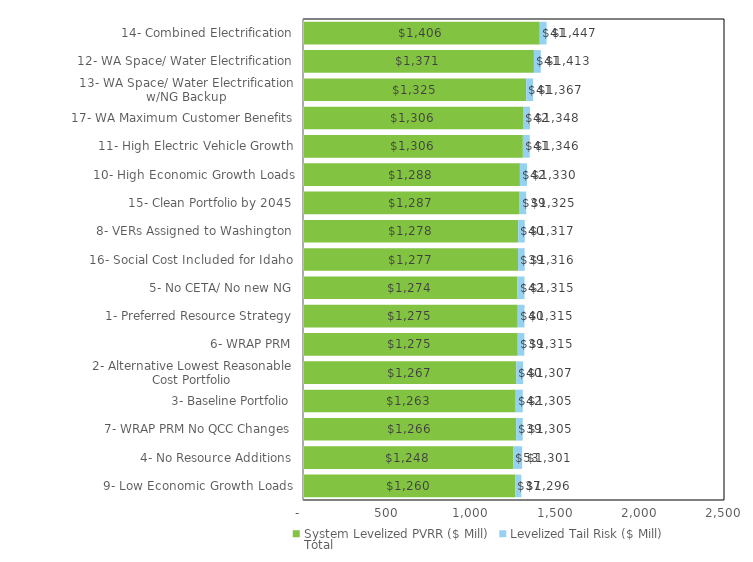
| Category | System Levelized PVRR ($ Mill) | Levelized Tail Risk ($ Mill) | Total |
|---|---|---|---|
| 9- Low Economic Growth Loads | 1259.873 | 36.511 | 1296.385 |
| 4- No Resource Additions | 1248.232 | 53.145 | 1301.377 |
| 7- WRAP PRM No QCC Changes | 1266.129 | 38.662 | 1304.791 |
| 3- Baseline Portfolio | 1262.967 | 42.243 | 1305.211 |
| 2- Alternative Lowest Reasonable Cost Portfolio | 1267.028 | 40.047 | 1307.075 |
| 6- WRAP PRM | 1275.11 | 39.414 | 1314.525 |
| 1- Preferred Resource Strategy | 1275.159 | 39.958 | 1315.117 |
| 5- No CETA/ No new NG | 1273.8 | 41.699 | 1315.499 |
| 16- Social Cost Included for Idaho | 1277.28 | 39.179 | 1316.459 |
| 8- VERs Assigned to Washington | 1277.598 | 39.525 | 1317.123 |
| 15- Clean Portfolio by 2045 | 1286.547 | 38.837 | 1325.384 |
| 10- High Economic Growth Loads | 1288.083 | 42.056 | 1330.138 |
| 11- High Electric Vehicle Growth | 1305.593 | 40.846 | 1346.44 |
| 17- WA Maximum Customer Benefits | 1306.386 | 41.581 | 1347.967 |
| 13- WA Space/ Water Electrification w/NG Backup | 1325.393 | 41.15 | 1366.543 |
| 12- WA Space/ Water Electrification | 1371.257 | 41.273 | 1412.53 |
| 14- Combined Electrification | 1405.904 | 40.763 | 1446.667 |